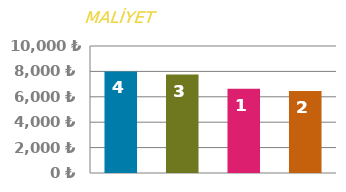
| Category | ÖN |
|---|---|
| 0 | 8000 |
| 1 | 7750 |
| 2 | 6625 |
| 3 | 6450 |